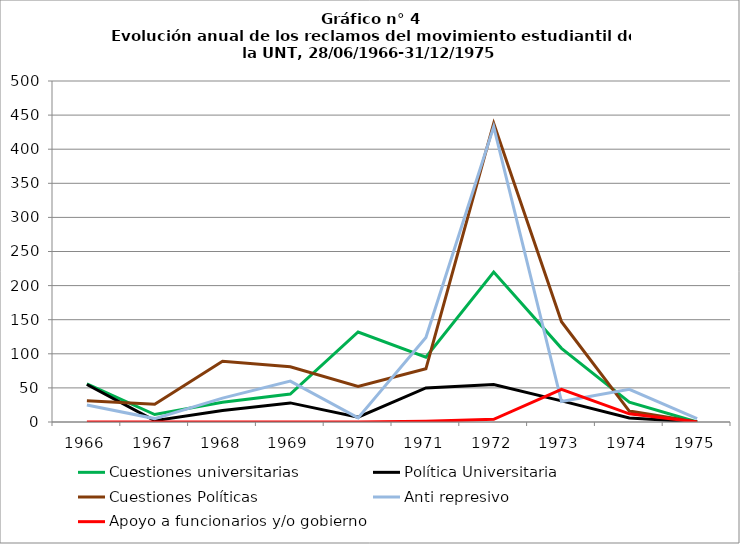
| Category | Cuestiones universitarias | Política Universitaria | Cuestiones Políticas | Anti represivo | Apoyo a funcionarios y/o gobierno |
|---|---|---|---|---|---|
| 1966.0 | 56 | 55 | 31 | 25 | 0 |
| 1967.0 | 11 | 2 | 26 | 5 | 0 |
| 1968.0 | 29 | 17 | 89 | 35 | 0 |
| 1969.0 | 41 | 28 | 81 | 60 | 0 |
| 1970.0 | 132 | 7 | 52 | 6 | 0 |
| 1971.0 | 95 | 50 | 78 | 124 | 1 |
| 1972.0 | 220 | 55 | 438 | 433 | 4 |
| 1973.0 | 108 | 31 | 147 | 30 | 48 |
| 1974.0 | 29 | 6 | 16 | 48 | 12 |
| 1975.0 | 0 | 0 | 0 | 5 | 0 |